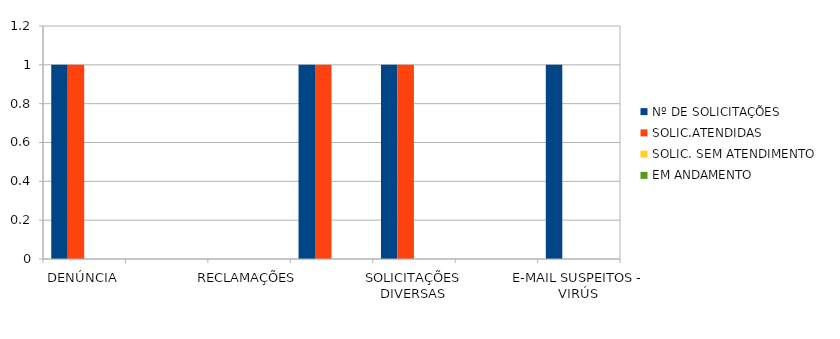
| Category | Nº DE SOLICITAÇÕES | SOLIC.ATENDIDAS | SOLIC. SEM ATENDIMENTO | EM ANDAMENTO |
|---|---|---|---|---|
| DENÚNCIA | 1 | 1 | 0 | 0 |
| DÚVIDA | 0 | 0 | 0 | 0 |
| RECLAMAÇÕES | 0 | 0 | 0 | 0 |
| PEDIDO DE ACESSO À INFORMAÇÃO | 1 | 1 | 0 | 0 |
| SOLICITAÇÕES DIVERSAS | 1 | 1 | 0 | 0 |
| SUGESTÃO  | 0 | 0 | 0 | 0 |
| E-MAIL SUSPEITOS - VIRÚS | 1 | 0 | 0 | 0 |